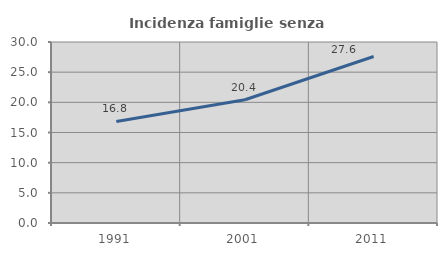
| Category | Incidenza famiglie senza nuclei |
|---|---|
| 1991.0 | 16.838 |
| 2001.0 | 20.433 |
| 2011.0 | 27.597 |